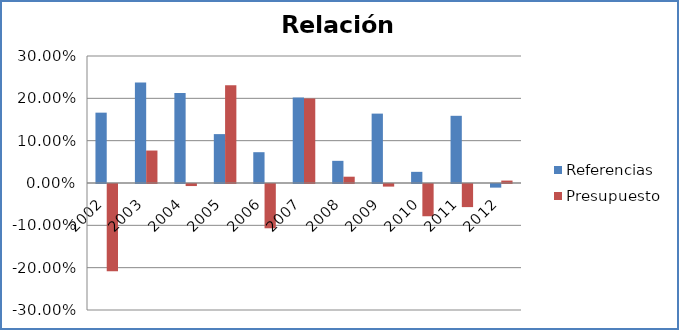
| Category | Referencias | Presupuesto |
|---|---|---|
| 2002 | 0.166 | -0.206 |
| 2003 | 0.237 | 0.077 |
| 2004 | 0.213 | -0.005 |
| 2005 | 0.115 | 0.231 |
| 2006 | 0.073 | -0.105 |
| 2007 | 0.202 | 0.199 |
| 2008 | 0.052 | 0.015 |
| 2009 | 0.164 | -0.006 |
| 2010 | 0.026 | -0.076 |
| 2011 | 0.159 | -0.055 |
| 2012 | -0.009 | 0.006 |